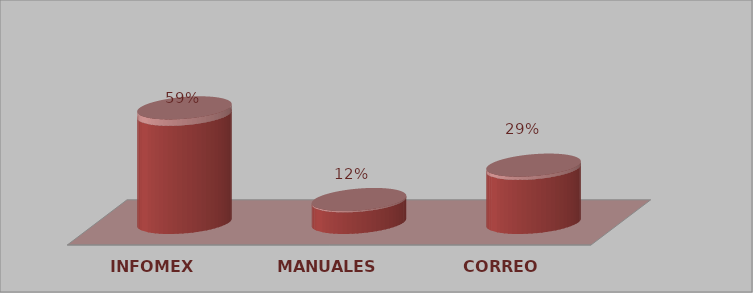
| Category | Series 0 | Series 1 |
|---|---|---|
| INFOMEX | 10 | 0.588 |
| MANUALES | 2 | 0.118 |
| CORREO | 5 | 0.294 |